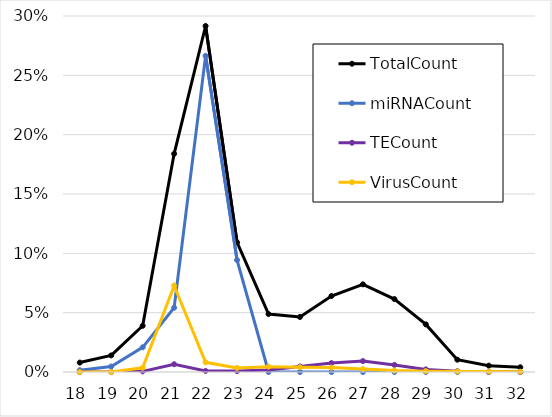
| Category | TotalCount | miRNACount | TECount | VirusCount |
|---|---|---|---|---|
| 18.0 | 0.008 | 0.002 | 0 | 0 |
| 19.0 | 0.014 | 0.005 | 0 | 0 |
| 20.0 | 0.039 | 0.021 | 0.001 | 0.004 |
| 21.0 | 0.184 | 0.054 | 0.007 | 0.073 |
| 22.0 | 0.292 | 0.266 | 0.001 | 0.008 |
| 23.0 | 0.109 | 0.094 | 0.001 | 0.003 |
| 24.0 | 0.049 | 0 | 0.002 | 0.005 |
| 25.0 | 0.046 | 0 | 0.005 | 0.004 |
| 26.0 | 0.064 | 0 | 0.008 | 0.004 |
| 27.0 | 0.074 | 0 | 0.009 | 0.002 |
| 28.0 | 0.061 | 0 | 0.006 | 0.001 |
| 29.0 | 0.04 | 0 | 0.002 | 0.001 |
| 30.0 | 0.01 | 0 | 0.001 | 0 |
| 31.0 | 0.005 | 0 | 0 | 0 |
| 32.0 | 0.004 | 0 | 0 | 0 |